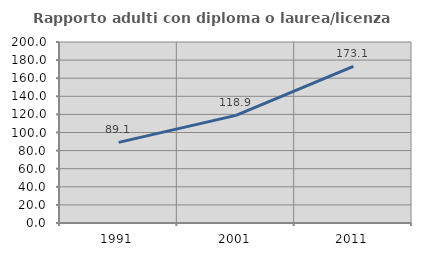
| Category | Rapporto adulti con diploma o laurea/licenza media  |
|---|---|
| 1991.0 | 89.062 |
| 2001.0 | 118.947 |
| 2011.0 | 173.118 |